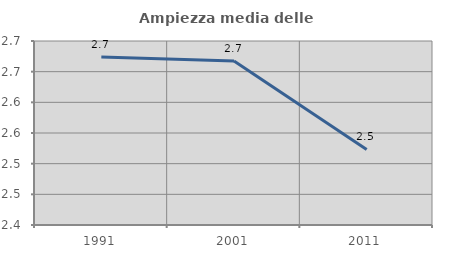
| Category | Ampiezza media delle famiglie |
|---|---|
| 1991.0 | 2.674 |
| 2001.0 | 2.667 |
| 2011.0 | 2.523 |